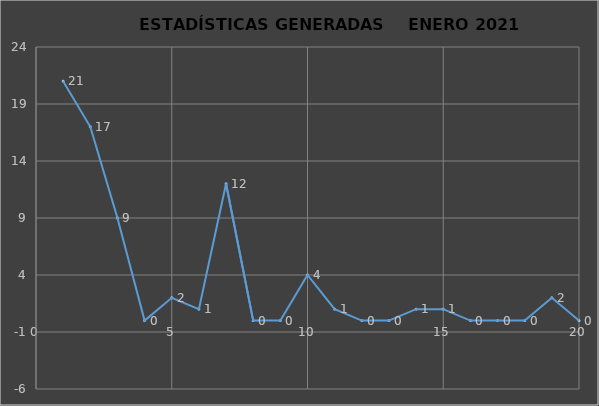
| Category |                   ESTADÍSTICAS GENERADAS     PERÍODO ENERO 2021 CANTIDAD |
|---|---|
| 0 | 21 |
| 1 | 17 |
| 2 | 9 |
| 3 | 0 |
| 4 | 2 |
| 5 | 1 |
| 6 | 12 |
| 7 | 0 |
| 8 | 0 |
| 9 | 4 |
| 10 | 1 |
| 11 | 0 |
| 12 | 0 |
| 13 | 1 |
| 14 | 1 |
| 15 | 0 |
| 16 | 0 |
| 17 | 0 |
| 18 | 2 |
| 19 | 0 |